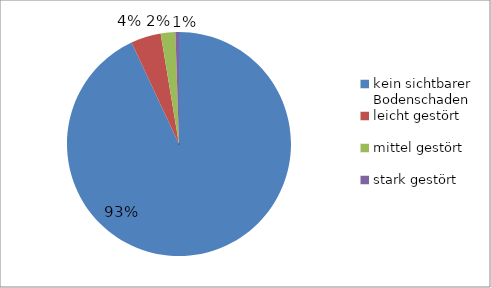
| Category | Series 0 |
|---|---|
| kein sichtbarer Bodenschaden | 1455 |
| leicht gestört | 68 |
| mittel gestört | 33 |
| stark gestört | 8 |